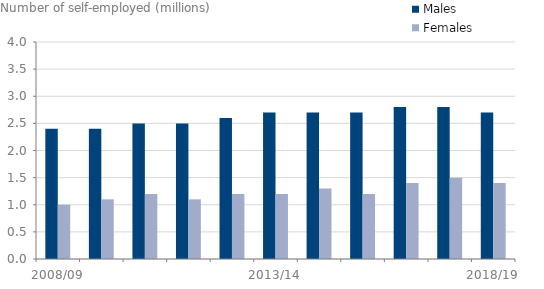
| Category | Males | Females |
|---|---|---|
| 2008/09 | 2.4 | 1 |
| 2009/10 | 2.4 | 1.1 |
| 2010/11 | 2.5 | 1.2 |
| 2011/12 | 2.5 | 1.1 |
| 2012/13 | 2.6 | 1.2 |
| 2013/14 | 2.7 | 1.2 |
| 2014/15 | 2.7 | 1.3 |
| 2015/16 | 2.7 | 1.2 |
| 2016/17 | 2.8 | 1.4 |
| 2017/18 | 2.8 | 1.5 |
| 2018/19 | 2.7 | 1.4 |